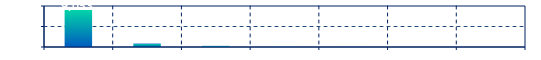
| Category | Series 0 |
|---|---|
| ZWAS1Z | 9053 |
| ZWAS2Z | 832 |
| ZWAS3Z | 277 |
| ZWAS4Z | 26 |
| ZWAS5Z | 22 |
| ZWAS6Z | 0 |
| ZWAS7Z | 0 |